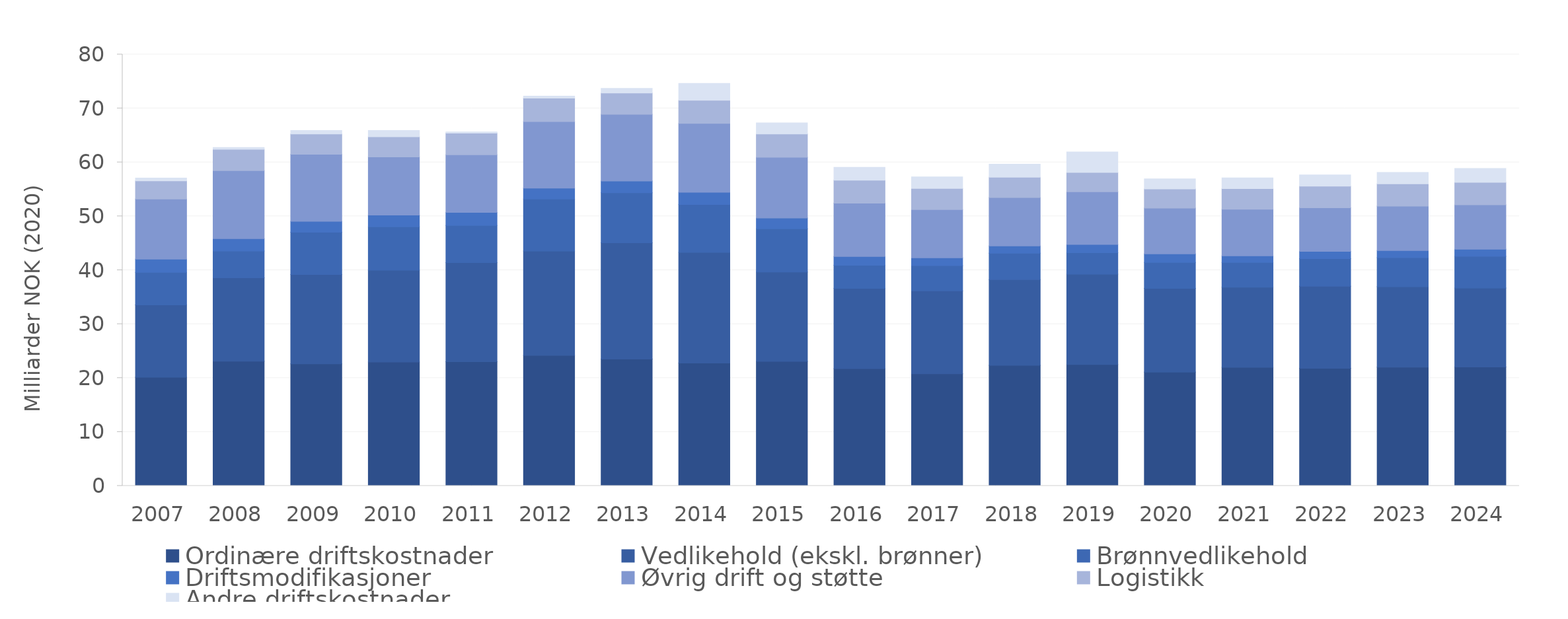
| Category | Ordinære driftskostnader | Vedlikehold (ekskl. brønner) | Brønnvedlikehold | Driftsmodifikasjoner | Øvrig drift og støtte | Logistikk | Andre driftskostnader |
|---|---|---|---|---|---|---|---|
| 2007.0 | 20.142 | 13.429 | 6.018 | 2.45 | 11.175 | 3.368 | 0.497 |
| 2008.0 | 23.115 | 15.475 | 4.974 | 2.282 | 12.621 | 3.939 | 0.335 |
| 2009.0 | 22.637 | 16.575 | 7.828 | 2.014 | 12.439 | 3.78 | 0.625 |
| 2010.0 | 22.98 | 17.029 | 8.037 | 2.17 | 10.803 | 3.735 | 1.153 |
| 2011.0 | 23.017 | 18.397 | 6.879 | 2.429 | 10.675 | 4.035 | 0.202 |
| 2012.0 | 24.188 | 19.376 | 9.651 | 2.011 | 12.341 | 4.336 | 0.392 |
| 2013.0 | 23.53 | 21.565 | 9.262 | 2.176 | 12.387 | 3.954 | 0.84 |
| 2014.0 | 22.778 | 20.543 | 8.865 | 2.275 | 12.774 | 4.285 | 3.129 |
| 2015.0 | 23.107 | 16.565 | 8.002 | 1.994 | 11.271 | 4.337 | 2.031 |
| 2016.0 | 21.757 | 14.869 | 4.302 | 1.612 | 9.894 | 4.261 | 2.388 |
| 2017.0 | 20.802 | 15.381 | 4.667 | 1.447 | 8.95 | 3.92 | 2.151 |
| 2018.0 | 22.361 | 15.907 | 4.899 | 1.344 | 8.979 | 3.76 | 2.426 |
| 2019.0 | 22.505 | 16.775 | 3.952 | 1.532 | 9.785 | 3.591 | 3.796 |
| 2020.0 | 21.101 | 15.525 | 4.818 | 1.596 | 8.467 | 3.576 | 1.838 |
| 2021.0 | 21.998 | 14.854 | 4.582 | 1.239 | 8.642 | 3.813 | 1.984 |
| 2022.0 | 21.815 | 15.204 | 5.133 | 1.348 | 8.084 | 4.003 | 2.09 |
| 2023.0 | 22.023 | 14.901 | 5.41 | 1.324 | 8.225 | 4.143 | 2.096 |
| 2024.0 | 22.059 | 14.621 | 5.879 | 1.33 | 8.229 | 4.173 | 2.574 |